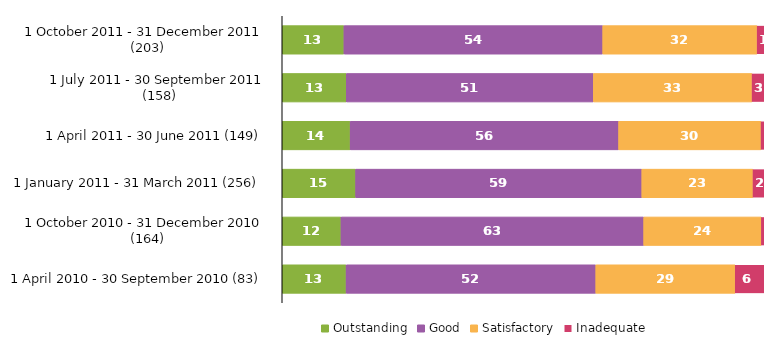
| Category | Outstanding | Good | Satisfactory | Inadequate |
|---|---|---|---|---|
| 1 October 2011 - 31 December 2011 (203) | 12.808 | 53.695 | 32.02 | 1.478 |
| 1 July 2011 - 30 September 2011 (158) | 13.291 | 51.266 | 32.911 | 2.532 |
| 1 April 2011 - 30 June 2011 (149) | 14.094 | 55.705 | 29.53 | 0.671 |
| 1 January 2011 - 31 March 2011 (256) | 15.234 | 59.375 | 23.047 | 2.344 |
| 1 October 2010 - 31 December 2010 (164) | 12.195 | 62.805 | 24.39 | 0.61 |
| 1 April 2010 - 30 September 2010 (83) | 13.253 | 51.807 | 28.916 | 6.024 |